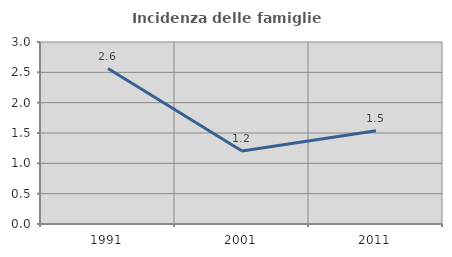
| Category | Incidenza delle famiglie numerose |
|---|---|
| 1991.0 | 2.562 |
| 2001.0 | 1.202 |
| 2011.0 | 1.537 |